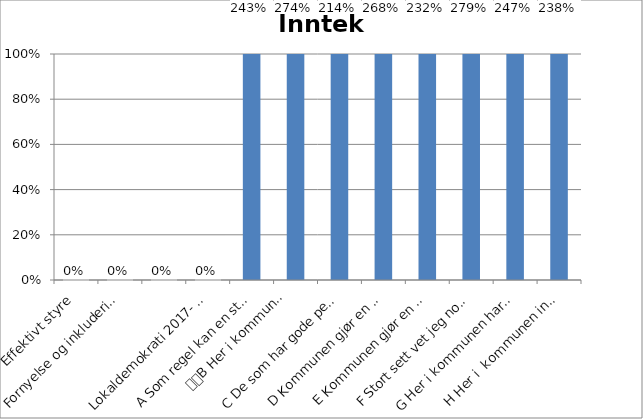
| Category | Series 0 |
|---|---|
| Effektivt styre  | 0 |
| Fornyelse og inkludering | 0 |
|  | 0 |
| Lokaldemokrati 2017- Innbyggere | 0 |
| A Som regel kan en stole på løftene fra politikerne her i kommunen | 2.434 |
|  
B Her i kommunen misbruker ikke de folkevalgte sin makt til personlig fordel  | 2.742 |
| C De som har gode personlige forbindelser i kommunen/kommunepolitikken, får lettere ivaretatt sine interesser | 2.137 |
| D Kommunen gjør en god jobb med å informere innbyggerne om aktuelle saker som diskuteres i kommunepolitikken | 2.684 |
| E Kommunen gjør en god jobb med å informere innbyggerne om hvordan kommunens inntekter brukes | 2.318 |
| F Stort sett vet jeg nok om forholdene her i kommunen til å bruke min stemmeseddel på en fornuftig måte i kommunevalget | 2.792 |
| G Her i kommunen har innbyggerne gode muligheter til å påvirke kommunale beslutninger som engasjerer dem. | 2.469 |
| H Her i  kommunen involverer politikerne innbyggerne i forsøk på å finne løsninger på lokale problemer | 2.376 |